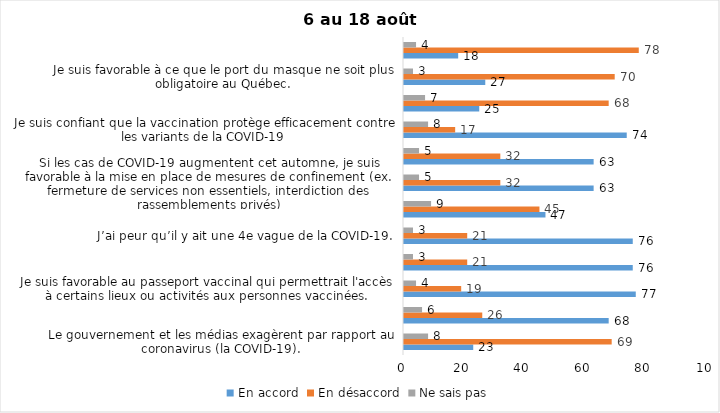
| Category | En accord | En désaccord | Ne sais pas |
|---|---|---|---|
| Le gouvernement et les médias exagèrent par rapport au coronavirus (la COVID-19). | 23 | 69 | 8 |
| J’ai peur que le système de santé soit débordé par les cas de COVID-19 suite au "déconfinement" | 68 | 26 | 6 |
| Je suis favorable au passeport vaccinal qui permettrait l'accès à certains lieux ou activités aux personnes vaccinées. | 77 | 19 | 4 |
| Malgré la levée des mesures de confinement, je préfère limiter mes contacts avec d’autres personnes (par ex., en évitant les activités sociales et de groupes) | 76 | 21 | 3 |
| J’ai peur qu’il y ait une 4e vague de la COVID-19. | 76 | 21 | 3 |
| Dans les régions en zone verte, le risque d’attraper la COVID-19 est minime. | 47 | 45 | 9 |
| Si les cas de COVID-19 augmentent cet automne, je suis favorable à la mise en place de mesures de confinement (ex. fermeture de services non essentiels, interdiction des rassemblements privés) | 63 | 32 | 5 |
| Je suis inquiet de contracter le variant Delta de la Covid-19 | 63 | 32 | 5 |
| Je suis confiant que la vaccination protège efficacement contre les variants de la COVID-19 | 74 | 17 | 8 |
| En raison de la baisse des cas de COID-19 je pense que le gouvernement du Québec devrait mettre fin à l’état d’urgence sanitaire | 25 | 68 | 7 |
| Je suis favorable à ce que le port du masque ne soit plus obligatoire au Québec. | 27 | 70 | 3 |
| Étant donné la progression de la vaccination, je pense qu’il est moins important de suivre les mesures de prévention. | 18 | 78 | 4 |